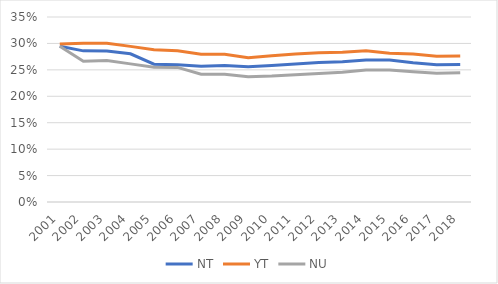
| Category | NT | YT | NU |
|---|---|---|---|
| 2001.0 | 0.295 | 0.299 | 0.295 |
| 2002.0 | 0.286 | 0.301 | 0.266 |
| 2003.0 | 0.286 | 0.3 | 0.268 |
| 2004.0 | 0.28 | 0.294 | 0.261 |
| 2005.0 | 0.261 | 0.288 | 0.255 |
| 2006.0 | 0.26 | 0.286 | 0.255 |
| 2007.0 | 0.257 | 0.28 | 0.242 |
| 2008.0 | 0.258 | 0.28 | 0.242 |
| 2009.0 | 0.256 | 0.273 | 0.237 |
| 2010.0 | 0.258 | 0.277 | 0.238 |
| 2011.0 | 0.261 | 0.28 | 0.241 |
| 2012.0 | 0.264 | 0.282 | 0.243 |
| 2013.0 | 0.266 | 0.283 | 0.246 |
| 2014.0 | 0.269 | 0.286 | 0.25 |
| 2015.0 | 0.269 | 0.282 | 0.25 |
| 2016.0 | 0.264 | 0.28 | 0.247 |
| 2017.0 | 0.26 | 0.276 | 0.244 |
| 2018.0 | 0.26 | 0.276 | 0.245 |